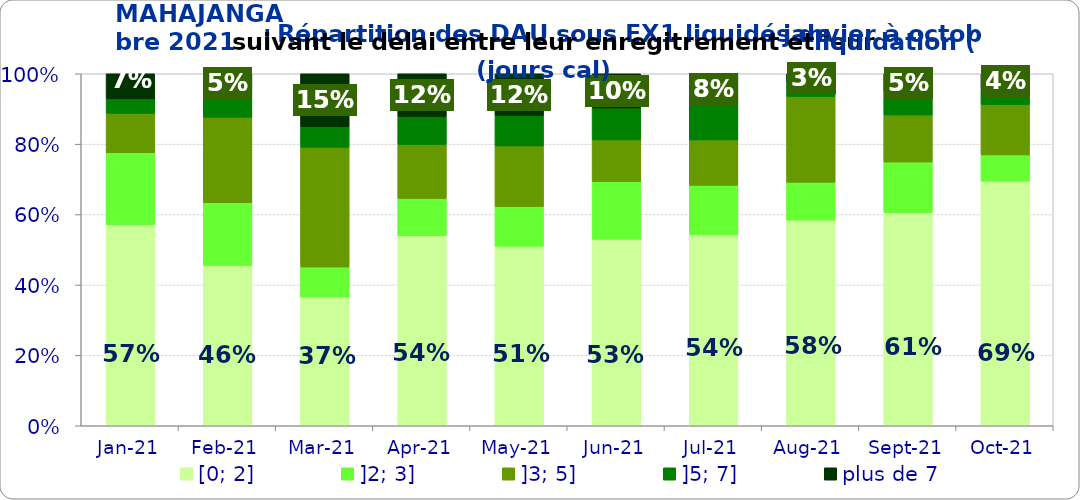
| Category | [0; 2] | ]2; 3] | ]3; 5] | ]5; 7] | plus de 7 |
|---|---|---|---|---|---|
| 2021-01-01 | 0.571 | 0.204 | 0.112 | 0.041 | 0.071 |
| 2021-02-01 | 0.455 | 0.178 | 0.243 | 0.074 | 0.05 |
| 2021-03-01 | 0.366 | 0.085 | 0.34 | 0.059 | 0.15 |
| 2021-04-01 | 0.54 | 0.106 | 0.153 | 0.079 | 0.122 |
| 2021-05-01 | 0.51 | 0.113 | 0.172 | 0.086 | 0.119 |
| 2021-06-01 | 0.53 | 0.164 | 0.118 | 0.091 | 0.098 |
| 2021-07-01 | 0.544 | 0.139 | 0.129 | 0.105 | 0.084 |
| 2021-08-01 | 0.584 | 0.108 | 0.244 | 0.039 | 0.025 |
| 2021-09-01 | 0.606 | 0.143 | 0.134 | 0.065 | 0.052 |
| 2021-10-01 | 0.695 | 0.075 | 0.143 | 0.045 | 0.042 |